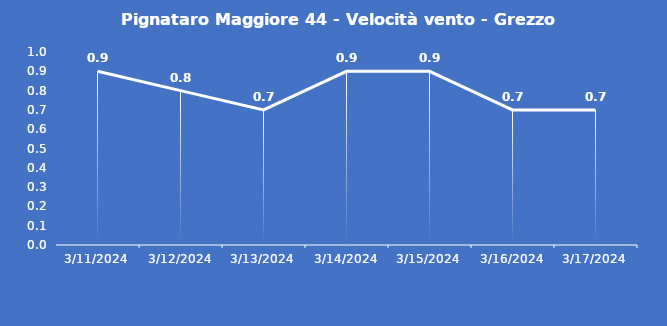
| Category | Pignataro Maggiore 44 - Velocità vento - Grezzo (m/s) |
|---|---|
| 3/11/24 | 0.9 |
| 3/12/24 | 0.8 |
| 3/13/24 | 0.7 |
| 3/14/24 | 0.9 |
| 3/15/24 | 0.9 |
| 3/16/24 | 0.7 |
| 3/17/24 | 0.7 |